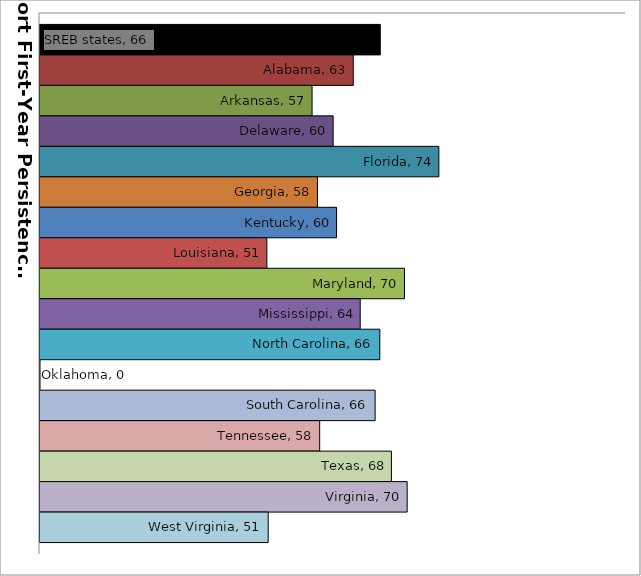
| Category | SREB states | Alabama | Arkansas | Delaware | Florida | Georgia | Kentucky | Louisiana | Maryland | Mississippi | North Carolina | Oklahoma | South Carolina | Tennessee | Texas | Virginia | West Virginia |
|---|---|---|---|---|---|---|---|---|---|---|---|---|---|---|---|---|---|
| 0 | 66.455 | 62.763 | 57.143 | 60.019 | 74.45 | 57.88 | 60.487 | 50.971 | 69.763 | 63.714 | 66.391 | 0 | 65.75 | 58.182 | 67.975 | 70.125 | 51.152 |